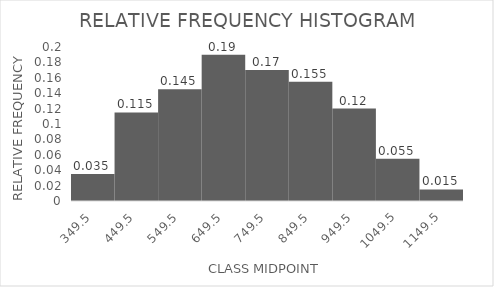
| Category | Series 0 |
|---|---|
| 349.5 | 0.035 |
| 449.5 | 0.115 |
| 549.5 | 0.145 |
| 649.5 | 0.19 |
| 749.5 | 0.17 |
| 849.5 | 0.155 |
| 949.5 | 0.12 |
| 1049.5 | 0.055 |
| 1149.5 | 0.015 |